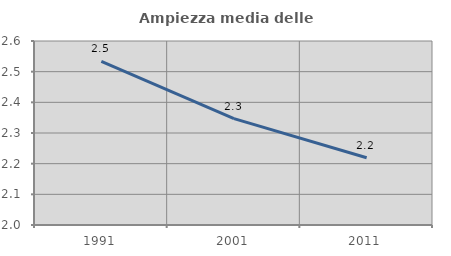
| Category | Ampiezza media delle famiglie |
|---|---|
| 1991.0 | 2.533 |
| 2001.0 | 2.347 |
| 2011.0 | 2.219 |